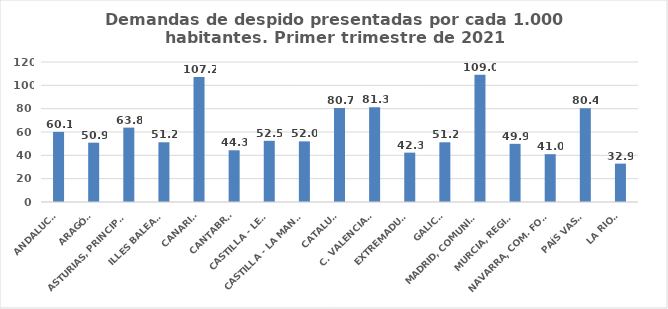
| Category | 616 |
|---|---|
| ANDALUCÍA | 60.093 |
| ARAGÓN | 50.854 |
| ASTURIAS, PRINCIPADO | 63.763 |
| ILLES BALEARS | 51.18 |
| CANARIAS | 107.214 |
| CANTABRIA | 44.326 |
| CASTILLA - LEÓN | 52.451 |
| CASTILLA - LA MANCHA | 51.958 |
| CATALUÑA | 80.676 |
| C. VALENCIANA | 81.277 |
| EXTREMADURA | 42.314 |
| GALICIA | 51.183 |
| MADRID, COMUNIDAD | 109.005 |
| MURCIA, REGIÓN | 49.87 |
| NAVARRA, COM. FORAL | 40.997 |
| PAÍS VASCO | 80.359 |
| LA RIOJA | 32.892 |